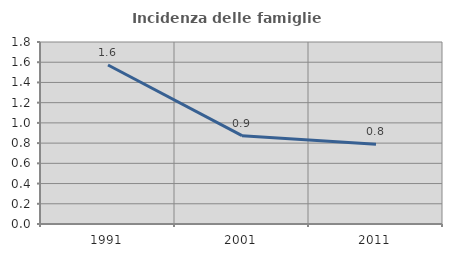
| Category | Incidenza delle famiglie numerose |
|---|---|
| 1991.0 | 1.572 |
| 2001.0 | 0.874 |
| 2011.0 | 0.788 |